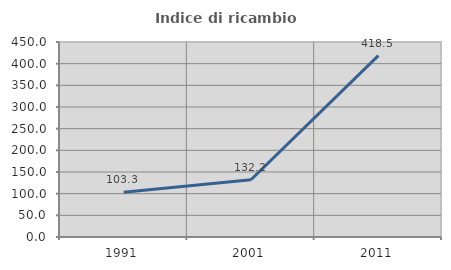
| Category | Indice di ricambio occupazionale  |
|---|---|
| 1991.0 | 103.333 |
| 2001.0 | 132.174 |
| 2011.0 | 418.519 |